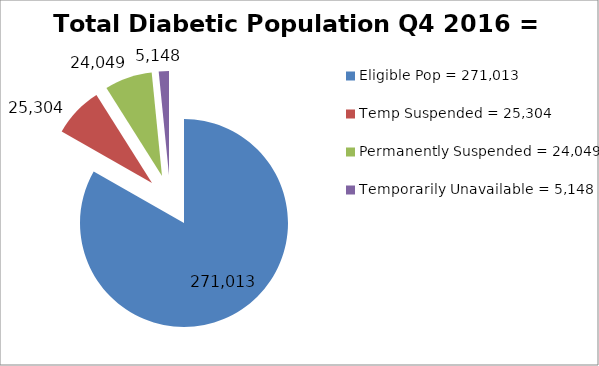
| Category | Total Diabetic Population Q4 2016 = 315,218 |
|---|---|
| Eligible Pop = 271,013 | 271013 |
| Temp Suspended = 25,304 | 25304 |
| Permanently Suspended = 24,049 | 24049 |
| Temporarily Unavailable = 5,148 | 5148 |